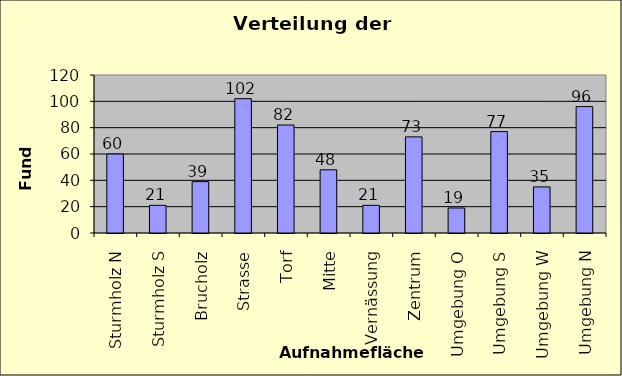
| Category | Series 0 |
|---|---|
| Sturmholz N | 60 |
| Sturmholz S | 21 |
| Brucholz | 39 |
| Strasse | 102 |
| Torf | 82 |
| Mitte | 48 |
| Vernässung | 21 |
| Zentrum | 73 |
| Umgebung O | 19 |
| Umgebung S | 77 |
| Umgebung W | 35 |
| Umgebung N | 96 |